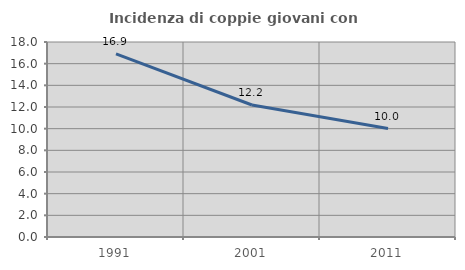
| Category | Incidenza di coppie giovani con figli |
|---|---|
| 1991.0 | 16.901 |
| 2001.0 | 12.186 |
| 2011.0 | 10.01 |